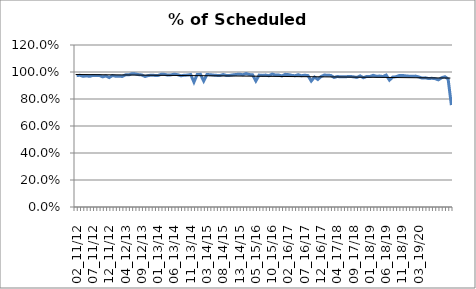
| Category | % of Scheduled Operated |
|---|---|
| 02_11/12 | 0.973 |
| 03_11/12 | 0.976 |
| 04_11/12 | 0.968 |
| 05_11/12 | 0.971 |
| 06_11/12 | 0.968 |
| 07_11/12 | 0.975 |
| 08_11/12 | 0.975 |
| 09_11/12 | 0.974 |
| 10_11/12 | 0.964 |
| 11_11/12 | 0.971 |
| 12_11/12 | 0.959 |
| 13_11/12 | 0.974 |
| 01_12/13 | 0.969 |
| 02_12/13 | 0.969 |
| 03_12/13 | 0.967 |
| 04_12/13 | 0.979 |
| 05_12/13 | 0.979 |
| 06_12/13 | 0.988 |
| 07_12/13 | 0.986 |
| 08_12/13 | 0.98 |
| 09_12/13 | 0.978 |
| 10_12/13 | 0.967 |
| 11_12/13 | 0.974 |
| 12_12/13 | 0.976 |
| 13_12/13 | 0.975 |
| 01_13/14 | 0.974 |
| 02_13/14 | 0.983 |
| 03_13/14 | 0.982 |
| 04_13/14 | 0.977 |
| 05_13/14 | 0.979 |
| 06_13/14 | 0.984 |
| 07_13/14 | 0.98 |
| 08_13/14 | 0.972 |
| 09_13/14 | 0.976 |
| 10_13/14 | 0.977 |
| 11_13/14 | 0.981 |
| 12_13/14 | 0.925 |
| 13_13/14 | 0.982 |
| 01_14/15 | 0.983 |
| 02_14/15 | 0.933 |
| 03_14/15 | 0.981 |
| 04_14/15 | 0.98 |
| 05_14/15 | 0.977 |
| 06_14/15 | 0.975 |
| 07_14/15 | 0.974 |
| 08_14/15 | 0.981 |
| 09_14/15 | 0.974 |
| 10_14/15 | 0.975 |
| 11_14/15 | 0.979 |
| 12_14/15 | 0.982 |
| 13_14/15 | 0.984 |
| 01_15/16 | 0.979 |
| 02_15/16 | 0.988 |
| 03_15/16 | 0.981 |
| 04_15/16 | 0.979 |
| 05_15/16 | 0.933 |
| 06_15/16 | 0.977 |
| 07_15/16 | 0.975 |
| 08_15/16 | 0.977 |
| 09_15/16 | 0.972 |
| 10_15/16 | 0.985 |
| 11_15/16 | 0.977 |
| 12_15/16 | 0.978 |
| 13_15/16 | 0.97 |
| 01_16/17 | 0.983 |
| 02_16/17 | 0.981 |
| 03_16/17 | 0.975 |
| 04_16/17 | 0.972 |
| 05_16/17 | 0.98 |
| 06_16/17 | 0.972 |
| 07_16/17 | 0.976 |
| 08_16/17 | 0.973 |
| 09_16/17 | 0.933 |
| 10_16/17 | 0.963 |
| 11_16/17 | 0.945 |
| 12_16/17 | 0.966 |
| 13_16/17 | 0.977 |
| 01_17/18 | 0.976 |
| 02_17/18 | 0.975 |
| 03_17/18 | 0.96 |
| 04_17/18 | 0.967 |
| 05_17/18 | 0.964 |
| 06_17/18 | 0.965 |
| 07_17/18 | 0.966 |
| 08_17/18 | 0.967 |
| 09_17/18 | 0.964 |
| 10_17/18 | 0.96 |
| 11_17/18 | 0.971 |
| 12_17/18 | 0.958 |
| 13_17/18 | 0.967 |
| 01_18/19 | 0.967 |
| 02_18/19 | 0.975 |
| 03_18/19 | 0.969 |
| 04_18/19 | 0.97 |
| 05_18/19 | 0.966 |
| 06_18/19 | 0.977 |
| 07_18/19 | 0.94 |
| 08_18/19 | 0.962 |
| 09_18/19 | 0.965 |
| 10_18/19 | 0.974 |
| 11_18/19 | 0.975 |
| 12_18/19 | 0.971 |
| 13_18/19 | 0.969 |
| 01_19/20 | 0.968 |
| 02_19/20 | 0.97 |
| 03_19/20 | 0.964 |
| 04_19/20 | 0.955 |